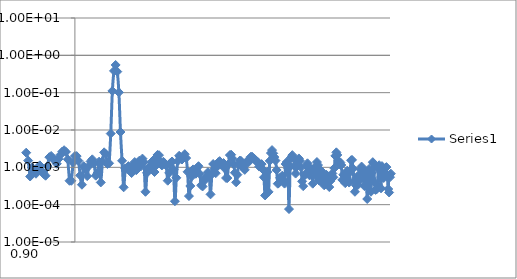
| Category | Series 0 |
|---|---|
| 0.00390625 | 1.403 |
| 0.0078125 | 0.412 |
| 0.01171875 | 0.04 |
| 0.015625 | 0.01 |
| 0.01953125 | 0.005 |
| 0.0234375 | 0.002 |
| 0.02734375 | 0.004 |
| 0.03125 | 0.005 |
| 0.03515625 | 0.004 |
| 0.0390625 | 0.002 |
| 0.04296875 | 0.002 |
| 0.046875 | 0.001 |
| 0.05078125 | 0.004 |
| 0.0546875 | 0.006 |
| 0.05859375 | 0.006 |
| 0.0625 | 0.005 |
| 0.06640625 | 0.004 |
| 0.0703125 | 0.002 |
| 0.07421875 | 0.002 |
| 0.078125 | 0.002 |
| 0.08203125 | 0.003 |
| 0.0859375 | 0.002 |
| 0.08984375 | 0.002 |
| 0.09375 | 0.002 |
| 0.09765625 | 0.002 |
| 0.1015625 | 0.001 |
| 0.1054688 | 0.001 |
| 0.109375 | 0.004 |
| 0.1132813 | 0.005 |
| 0.1171875 | 0.003 |
| 0.1210938 | 0.002 |
| 0.125 | 0.002 |
| 0.1289063 | 0.002 |
| 0.1328125 | 0.001 |
| 0.1367188 | 0.002 |
| 0.140625 | 0.003 |
| 0.1445313 | 0.001 |
| 0.1484375 | 0.001 |
| 0.1523438 | 0.002 |
| 0.15625 | 0.003 |
| 0.1601563 | 0.005 |
| 0.1640625 | 0.006 |
| 0.1679688 | 0.007 |
| 0.171875 | 0.006 |
| 0.1757813 | 0.004 |
| 0.1796875 | 0.003 |
| 0.1835938 | 0.002 |
| 0.1875 | 0.001 |
| 0.1914063 | 0.002 |
| 0.1953125 | 0.002 |
| 0.1992188 | 0.002 |
| 0.203125 | 0.003 |
| 0.2070313 | 0.004 |
| 0.2109375 | 0.004 |
| 0.2148438 | 0.003 |
| 0.21875 | 0.002 |
| 0.2226563 | 0.001 |
| 0.2265625 | 0 |
| 0.2304688 | 0.001 |
| 0.234375 | 0.002 |
| 0.2382813 | 0.002 |
| 0.2421875 | 0.001 |
| 0.2460938 | 0.002 |
| 0.25 | 0.002 |
| 0.2539063 | 0.002 |
| 0.2578125 | 0 |
| 0.2617188 | 0.001 |
| 0.265625 | 0.001 |
| 0.2695313 | 0.002 |
| 0.2734375 | 0.003 |
| 0.2773438 | 0.003 |
| 0.28125 | 0.002 |
| 0.2851563 | 0.003 |
| 0.2890625 | 0.004 |
| 0.2929688 | 0.003 |
| 0.296875 | 0.003 |
| 0.3007813 | 0.002 |
| 0.3046875 | 0.001 |
| 0.3085938 | 0.001 |
| 0.3125 | 0 |
| 0.3164063 | 0 |
| 0.3203125 | 0.001 |
| 0.3242188 | 0.001 |
| 0.328125 | 0.002 |
| 0.3320313 | 0.003 |
| 0.3359375 | 0.003 |
| 0.3398438 | 0.002 |
| 0.34375 | 0.001 |
| 0.3476563 | 0.001 |
| 0.3515625 | 0.002 |
| 0.3554688 | 0.001 |
| 0.359375 | 0.001 |
| 0.3632813 | 0 |
| 0.3671875 | 0 |
| 0.3710938 | 0.001 |
| 0.375 | 0.001 |
| 0.3789063 | 0 |
| 0.3828125 | 0.001 |
| 0.3867188 | 0.002 |
| 0.390625 | 0.001 |
| 0.3945313 | 0.001 |
| 0.3984375 | 0.001 |
| 0.4023438 | 0.002 |
| 0.40625 | 0.001 |
| 0.4101563 | 0.002 |
| 0.4140625 | 0.002 |
| 0.4179688 | 0.002 |
| 0.421875 | 0.001 |
| 0.4257813 | 0.001 |
| 0.4296875 | 0.002 |
| 0.4335938 | 0.002 |
| 0.4375 | 0.001 |
| 0.4414063 | 0.001 |
| 0.4453125 | 0.002 |
| 0.4492188 | 0.001 |
| 0.453125 | 0.002 |
| 0.4570313 | 0.002 |
| 0.4609375 | 0.002 |
| 0.4648438 | 0.003 |
| 0.46875 | 0.003 |
| 0.4726563 | 0.001 |
| 0.4765625 | 0.001 |
| 0.4804688 | 0.001 |
| 0.484375 | 0.001 |
| 0.4882813 | 0.001 |
| 0.4921875 | 0.001 |
| 0.4960938 | 0.002 |
| 0.5 | 0.001 |
| 0.5039063 | 0.001 |
| 0.5078125 | 0.002 |
| 0.5117188 | 0.003 |
| 0.515625 | 0.003 |
| 0.5195313 | 0.002 |
| 0.5234375 | 0.002 |
| 0.5273438 | 0.001 |
| 0.53125 | 0.001 |
| 0.5351563 | 0.002 |
| 0.5390625 | 0.002 |
| 0.5429688 | 0.002 |
| 0.546875 | 0.001 |
| 0.5507813 | 0.001 |
| 0.5546875 | 0.001 |
| 0.5585938 | 0.001 |
| 0.5625 | 0.001 |
| 0.5664063 | 0.002 |
| 0.5703125 | 0.001 |
| 0.5742188 | 0 |
| 0.578125 | 0.001 |
| 0.5820313 | 0.002 |
| 0.5859375 | 0.003 |
| 0.5898438 | 0.004 |
| 0.59375 | 0.003 |
| 0.5976563 | 0.001 |
| 0.6015625 | 0 |
| 0.6054688 | 0.002 |
| 0.609375 | 0.003 |
| 0.6132813 | 0.001 |
| 0.6171875 | 0.001 |
| 0.6210938 | 0.003 |
| 0.625 | 0.003 |
| 0.6289063 | 0.002 |
| 0.6328125 | 0.001 |
| 0.6367188 | 0.001 |
| 0.640625 | 0 |
| 0.6445313 | 0 |
| 0.6484375 | 0.001 |
| 0.6523438 | 0.002 |
| 0.65625 | 0.002 |
| 0.6601563 | 0.002 |
| 0.6640625 | 0.002 |
| 0.6679688 | 0.001 |
| 0.671875 | 0.001 |
| 0.6757813 | 0.001 |
| 0.6796875 | 0.002 |
| 0.6835938 | 0.003 |
| 0.6875 | 0.003 |
| 0.6914063 | 0.002 |
| 0.6953125 | 0.002 |
| 0.6992188 | 0.002 |
| 0.703125 | 0.002 |
| 0.7070313 | 0.001 |
| 0.7109375 | 0.001 |
| 0.7148438 | 0.001 |
| 0.71875 | 0.001 |
| 0.7226563 | 0 |
| 0.7265625 | 0.001 |
| 0.7304688 | 0.001 |
| 0.734375 | 0 |
| 0.7382813 | 0.001 |
| 0.7421875 | 0.002 |
| 0.7460938 | 0.003 |
| 0.75 | 0.003 |
| 0.7539063 | 0.002 |
| 0.7578125 | 0.002 |
| 0.7617188 | 0.002 |
| 0.765625 | 0.002 |
| 0.7695313 | 0.002 |
| 0.7734375 | 0.002 |
| 0.7773438 | 0.001 |
| 0.78125 | 0.001 |
| 0.7851563 | 0.001 |
| 0.7890625 | 0 |
| 0.7929688 | 0 |
| 0.796875 | 0.001 |
| 0.8007813 | 0.001 |
| 0.8046875 | 0.001 |
| 0.8085938 | 0.002 |
| 0.8125 | 0.003 |
| 0.8164063 | 0.002 |
| 0.8203125 | 0.001 |
| 0.8242188 | 0.001 |
| 0.828125 | 0 |
| 0.8320313 | 0.001 |
| 0.8359375 | 0.001 |
| 0.8398438 | 0.001 |
| 0.84375 | 0.001 |
| 0.8476563 | 0 |
| 0.8515625 | 0 |
| 0.8554688 | 0 |
| 0.859375 | 0.001 |
| 0.8632813 | 0.002 |
| 0.8671875 | 0.001 |
| 0.8710938 | 0.001 |
| 0.875 | 0.001 |
| 0.8789063 | 0.002 |
| 0.8828125 | 0.002 |
| 0.8867188 | 0.002 |
| 0.890625 | 0.002 |
| 0.8945313 | 0.003 |
| 0.8984375 | 0.002 |
| 0.9023438 | 0.002 |
| 0.90625 | 0.001 |
| 0.9101563 | 0.001 |
| 0.9140625 | 0.001 |
| 0.9179688 | 0.001 |
| 0.921875 | 0.001 |
| 0.9257813 | 0.001 |
| 0.9296875 | 0.001 |
| 0.9335938 | 0.001 |
| 0.9375 | 0.001 |
| 0.9414063 | 0.001 |
| 0.9453125 | 0.002 |
| 0.9492188 | 0.002 |
| 0.953125 | 0.002 |
| 0.9570313 | 0.001 |
| 0.9609375 | 0.001 |
| 0.9648438 | 0.002 |
| 0.96875 | 0.002 |
| 0.9726563 | 0.003 |
| 0.9765625 | 0.003 |
| 0.9804688 | 0.003 |
| 0.984375 | 0.002 |
| 0.9882813 | 0 |
| 0.9921875 | 0 |
| 0.9960938 | 0.001 |
| 1.0 | 0.002 |
| 1.003906 | 0.002 |
| 1.007813 | 0.002 |
| 1.011719 | 0.001 |
| 1.015625 | 0 |
| 1.019531 | 0.001 |
| 1.023438 | 0.001 |
| 1.027344 | 0.001 |
| 1.03125 | 0.001 |
| 1.035156 | 0.001 |
| 1.039063 | 0.002 |
| 1.042969 | 0.001 |
| 1.046875 | 0.001 |
| 1.050781 | 0.001 |
| 1.054688 | 0.001 |
| 1.058594 | 0 |
| 1.0625 | 0.001 |
| 1.066406 | 0.003 |
| 1.070313 | 0.002 |
| 1.074219 | 0.001 |
| 1.078125 | 0.001 |
| 1.082031 | 0.008 |
| 1.085938 | 0.111 |
| 1.089844 | 0.383 |
| 1.09375 | 0.552 |
| 1.097656 | 0.366 |
| 1.101563 | 0.102 |
| 1.105469 | 0.009 |
| 1.109375 | 0.001 |
| 1.113281 | 0 |
| 1.117188 | 0.001 |
| 1.121094 | 0.001 |
| 1.125 | 0.001 |
| 1.128906 | 0.001 |
| 1.132813 | 0.001 |
| 1.136719 | 0.001 |
| 1.140625 | 0.001 |
| 1.144531 | 0.001 |
| 1.148438 | 0.001 |
| 1.152344 | 0.002 |
| 1.15625 | 0.001 |
| 1.160156 | 0.002 |
| 1.164063 | 0.001 |
| 1.167969 | 0 |
| 1.171875 | 0.001 |
| 1.175781 | 0.001 |
| 1.179688 | 0.001 |
| 1.183594 | 0.001 |
| 1.1875 | 0.002 |
| 1.191406 | 0.001 |
| 1.195313 | 0.001 |
| 1.199219 | 0.002 |
| 1.203125 | 0.002 |
| 1.207031 | 0.001 |
| 1.210938 | 0.001 |
| 1.214844 | 0.001 |
| 1.21875 | 0.001 |
| 1.222656 | 0.001 |
| 1.226563 | 0 |
| 1.230469 | 0.001 |
| 1.234375 | 0.001 |
| 1.238281 | 0.001 |
| 1.242188 | 0.001 |
| 1.246094 | 0 |
| 1.25 | 0.001 |
| 1.253906 | 0.001 |
| 1.257813 | 0.002 |
| 1.261719 | 0.002 |
| 1.265625 | 0.002 |
| 1.269531 | 0.002 |
| 1.273438 | 0.002 |
| 1.277344 | 0.002 |
| 1.28125 | 0.001 |
| 1.285156 | 0 |
| 1.289063 | 0 |
| 1.292969 | 0.001 |
| 1.296875 | 0.001 |
| 1.300781 | 0.001 |
| 1.304688 | 0.001 |
| 1.308594 | 0.001 |
| 1.3125 | 0.001 |
| 1.316406 | 0.001 |
| 1.320313 | 0 |
| 1.324219 | 0 |
| 1.328125 | 0 |
| 1.332031 | 0.001 |
| 1.335938 | 0.001 |
| 1.339844 | 0.001 |
| 1.34375 | 0.001 |
| 1.347656 | 0 |
| 1.351563 | 0.001 |
| 1.355469 | 0.001 |
| 1.359375 | 0.001 |
| 1.363281 | 0.001 |
| 1.367188 | 0.001 |
| 1.371094 | 0.001 |
| 1.375 | 0.001 |
| 1.378906 | 0.001 |
| 1.382813 | 0.001 |
| 1.386719 | 0.001 |
| 1.390625 | 0.001 |
| 1.394531 | 0.001 |
| 1.398438 | 0.001 |
| 1.402344 | 0.001 |
| 1.40625 | 0.002 |
| 1.410156 | 0.002 |
| 1.414063 | 0.002 |
| 1.417969 | 0.001 |
| 1.421875 | 0.001 |
| 1.425781 | 0 |
| 1.429688 | 0.001 |
| 1.433594 | 0.001 |
| 1.4375 | 0.002 |
| 1.441406 | 0.001 |
| 1.445313 | 0.001 |
| 1.449219 | 0.001 |
| 1.453125 | 0.001 |
| 1.457031 | 0.001 |
| 1.460938 | 0.001 |
| 1.464844 | 0.001 |
| 1.46875 | 0.002 |
| 1.472656 | 0.002 |
| 1.476563 | 0.002 |
| 1.480469 | 0.002 |
| 1.484375 | 0.002 |
| 1.488281 | 0.001 |
| 1.492188 | 0.001 |
| 1.496094 | 0.001 |
| 1.5 | 0.001 |
| 1.503906 | 0.001 |
| 1.507813 | 0.001 |
| 1.511719 | 0.001 |
| 1.515625 | 0.001 |
| 1.519531 | 0 |
| 1.523438 | 0.001 |
| 1.527344 | 0.001 |
| 1.53125 | 0 |
| 1.535156 | 0.001 |
| 1.539063 | 0.002 |
| 1.542969 | 0.003 |
| 1.546875 | 0.002 |
| 1.550781 | 0.002 |
| 1.554688 | 0.002 |
| 1.558594 | 0.001 |
| 1.5625 | 0 |
| 1.566406 | 0 |
| 1.570313 | 0.001 |
| 1.574219 | 0.001 |
| 1.578125 | 0.001 |
| 1.582031 | 0 |
| 1.585938 | 0 |
| 1.589844 | 0.001 |
| 1.59375 | 0.001 |
| 1.597656 | 0.001 |
| 1.601563 | 0 |
| 1.605469 | 0.001 |
| 1.609375 | 0.002 |
| 1.613281 | 0.002 |
| 1.617188 | 0.002 |
| 1.621094 | 0.001 |
| 1.625 | 0.001 |
| 1.628906 | 0.001 |
| 1.632813 | 0.001 |
| 1.636719 | 0.002 |
| 1.640625 | 0.002 |
| 1.644531 | 0.001 |
| 1.648438 | 0 |
| 1.652344 | 0 |
| 1.65625 | 0.001 |
| 1.660156 | 0.001 |
| 1.664063 | 0.001 |
| 1.667969 | 0.001 |
| 1.671875 | 0.001 |
| 1.675781 | 0.001 |
| 1.679688 | 0.001 |
| 1.683594 | 0.001 |
| 1.6875 | 0 |
| 1.691406 | 0.001 |
| 1.695313 | 0.001 |
| 1.699219 | 0.001 |
| 1.703125 | 0.001 |
| 1.707031 | 0.001 |
| 1.710938 | 0 |
| 1.714844 | 0.001 |
| 1.71875 | 0.001 |
| 1.722656 | 0.001 |
| 1.726563 | 0 |
| 1.730469 | 0 |
| 1.734375 | 0.001 |
| 1.738281 | 0.001 |
| 1.742188 | 0.001 |
| 1.746094 | 0 |
| 1.75 | 0 |
| 1.753906 | 0 |
| 1.757813 | 0.001 |
| 1.761719 | 0.001 |
| 1.765625 | 0.001 |
| 1.769531 | 0.001 |
| 1.773438 | 0.002 |
| 1.777344 | 0.003 |
| 1.78125 | 0.002 |
| 1.785156 | 0.002 |
| 1.789063 | 0.001 |
| 1.792969 | 0.001 |
| 1.796875 | 0.001 |
| 1.800781 | 0 |
| 1.804688 | 0.001 |
| 1.808594 | 0.001 |
| 1.8125 | 0 |
| 1.816406 | 0.001 |
| 1.820313 | 0.001 |
| 1.824219 | 0.001 |
| 1.828125 | 0 |
| 1.832031 | 0.001 |
| 1.835938 | 0.002 |
| 1.839844 | 0.002 |
| 1.84375 | 0.001 |
| 1.847656 | 0 |
| 1.851563 | 0 |
| 1.855469 | 0 |
| 1.859375 | 0.001 |
| 1.863281 | 0 |
| 1.867188 | 0 |
| 1.871094 | 0.001 |
| 1.875 | 0.001 |
| 1.878906 | 0.001 |
| 1.882813 | 0.001 |
| 1.886719 | 0.001 |
| 1.890625 | 0 |
| 1.894531 | 0.001 |
| 1.898438 | 0.001 |
| 1.902344 | 0 |
| 1.90625 | 0.001 |
| 1.910156 | 0.001 |
| 1.914063 | 0.001 |
| 1.917969 | 0 |
| 1.921875 | 0.001 |
| 1.925781 | 0.001 |
| 1.929688 | 0.001 |
| 1.933594 | 0 |
| 1.9375 | 0 |
| 1.941406 | 0 |
| 1.945313 | 0 |
| 1.949219 | 0.001 |
| 1.953125 | 0.001 |
| 1.957031 | 0.001 |
| 1.960938 | 0 |
| 1.964844 | 0.001 |
| 1.96875 | 0.001 |
| 1.972656 | 0.001 |
| 1.976563 | 0.001 |
| 1.980469 | 0.001 |
| 1.984375 | 0.001 |
| 1.988281 | 0.001 |
| 1.992188 | 0 |
| 1.996094 | 0 |
| 2.0 | 0.001 |
| 2.003906 | 0.001 |
| 2.007813 | 0 |
| 2.011719 | 0 |
| 2.015625 | 0 |
| 2.019531 | 0.001 |
| 2.023438 | 0.002 |
| 2.027344 | 0.002 |
| 2.03125 | 0.002 |
| 2.035156 | 0.002 |
| 2.039063 | 0.002 |
| 2.042969 | 0.001 |
| 2.046875 | 0.002 |
| 2.050781 | 0.002 |
| 2.054688 | 0.002 |
| 2.058594 | 0.001 |
| 2.0625 | 0.001 |
| 2.066406 | 0.001 |
| 2.070313 | 0.001 |
| 2.074219 | 0.001 |
| 2.078125 | 0.001 |
| 2.082031 | 0.001 |
| 2.085938 | 0.001 |
| 2.089844 | 0.001 |
| 2.09375 | 0.001 |
| 2.097656 | 0.001 |
| 2.101563 | 0.001 |
| 2.105469 | 0.001 |
| 2.109375 | 0.001 |
| 2.113281 | 0 |
| 2.117188 | 0 |
| 2.121094 | 0.001 |
| 2.125 | 0.001 |
| 2.128906 | 0.001 |
| 2.132813 | 0.001 |
| 2.136719 | 0.001 |
| 2.140625 | 0.001 |
| 2.144531 | 0 |
| 2.148438 | 0 |
| 2.152344 | 0.001 |
| 2.15625 | 0.001 |
| 2.160156 | 0.001 |
| 2.164063 | 0.001 |
| 2.167969 | 0.001 |
| 2.171875 | 0 |
| 2.175781 | 0.001 |
| 2.179688 | 0.001 |
| 2.183594 | 0.001 |
| 2.1875 | 0.001 |
| 2.191406 | 0.001 |
| 2.195313 | 0.001 |
| 2.199219 | 0 |
| 2.203125 | 0 |
| 2.207031 | 0.001 |
| 2.210938 | 0.001 |
| 2.214844 | 0.001 |
| 2.21875 | 0.001 |
| 2.222656 | 0.001 |
| 2.226563 | 0.001 |
| 2.230469 | 0.002 |
| 2.234375 | 0.001 |
| 2.238281 | 0.001 |
| 2.242188 | 0.001 |
| 2.246094 | 0 |
| 2.25 | 0.001 |
| 2.253906 | 0.001 |
| 2.257813 | 0.001 |
| 2.261719 | 0.001 |
| 2.265625 | 0.001 |
| 2.269531 | 0.001 |
| 2.273438 | 0 |
| 2.277344 | 0 |
| 2.28125 | 0 |
| 2.285156 | 0 |
| 2.289063 | 0 |
| 2.292969 | 0.001 |
| 2.296875 | 0.001 |
| 2.300781 | 0.001 |
| 2.304688 | 0 |
| 2.308594 | 0.001 |
| 2.3125 | 0.001 |
| 2.316406 | 0.001 |
| 2.320313 | 0.001 |
| 2.324219 | 0.001 |
| 2.328125 | 0.001 |
| 2.332031 | 0.001 |
| 2.335938 | 0.001 |
| 2.339844 | 0 |
| 2.34375 | 0.001 |
| 2.347656 | 0.001 |
| 2.351563 | 0.001 |
| 2.355469 | 0.001 |
| 2.359375 | 0.001 |
| 2.363281 | 0.001 |
| 2.367188 | 0 |
| 2.371094 | 0 |
| 2.375 | 0 |
| 2.378906 | 0.001 |
| 2.382813 | 0.001 |
| 2.386719 | 0.001 |
| 2.390625 | 0 |
| 2.394531 | 0 |
| 2.398438 | 0 |
| 2.402344 | 0 |
| 2.40625 | 0 |
| 2.410156 | 0.001 |
| 2.414063 | 0 |
| 2.417969 | 0.001 |
| 2.421875 | 0.001 |
| 2.425781 | 0 |
| 2.429688 | 0.001 |
| 2.433594 | 0.001 |
| 2.4375 | 0.001 |
| 2.441406 | 0.001 |
| 2.445313 | 0.002 |
| 2.449219 | 0.001 |
| 2.453125 | 0.001 |
| 2.457031 | 0.001 |
| 2.460938 | 0.001 |
| 2.464844 | 0.001 |
| 2.46875 | 0.001 |
| 2.472656 | 0.001 |
| 2.476563 | 0.001 |
| 2.480469 | 0.002 |
| 2.484375 | 0.001 |
| 2.488281 | 0 |
| 2.492188 | 0.001 |
| 2.496094 | 0.001 |
| 2.5 | 0.001 |
| 2.503906 | 0 |
| 2.507813 | 0 |
| 2.511719 | 0 |
| 2.515625 | 0.001 |
| 2.519531 | 0.001 |
| 2.523438 | 0.001 |
| 2.527344 | 0.001 |
| 2.53125 | 0.001 |
| 2.535156 | 0.001 |
| 2.539063 | 0.001 |
| 2.542969 | 0.001 |
| 2.546875 | 0.001 |
| 2.550781 | 0 |
| 2.554688 | 0 |
| 2.558594 | 0.001 |
| 2.5625 | 0.001 |
| 2.566406 | 0.001 |
| 2.570313 | 0.001 |
| 2.574219 | 0.001 |
| 2.578125 | 0.001 |
| 2.582031 | 0.001 |
| 2.585938 | 0.001 |
| 2.589844 | 0.001 |
| 2.59375 | 0.001 |
| 2.597656 | 0.001 |
| 2.601563 | 0.001 |
| 2.605469 | 0.001 |
| 2.609375 | 0.001 |
| 2.613281 | 0 |
| 2.617188 | 0 |
| 2.621094 | 0 |
| 2.625 | 0 |
| 2.628906 | 0.001 |
| 2.632813 | 0.001 |
| 2.636719 | 0 |
| 2.640625 | 0 |
| 2.644531 | 0 |
| 2.648438 | 0.001 |
| 2.652344 | 0.001 |
| 2.65625 | 0.001 |
| 2.660156 | 0 |
| 2.664063 | 0.001 |
| 2.667969 | 0.001 |
| 2.671875 | 0 |
| 2.675781 | 0 |
| 2.679688 | 0 |
| 2.683594 | 0 |
| 2.6875 | 0 |
| 2.691406 | 0 |
| 2.695313 | 0 |
| 2.699219 | 0 |
| 2.703125 | 0 |
| 2.707031 | 0 |
| 2.710938 | 0 |
| 2.714844 | 0 |
| 2.71875 | 0 |
| 2.722656 | 0.001 |
| 2.726563 | 0 |
| 2.730469 | 0 |
| 2.734375 | 0.001 |
| 2.738281 | 0.001 |
| 2.742188 | 0.001 |
| 2.746094 | 0.001 |
| 2.75 | 0 |
| 2.753906 | 0 |
| 2.757813 | 0 |
| 2.761719 | 0 |
| 2.765625 | 0.001 |
| 2.769531 | 0.001 |
| 2.773438 | 0.001 |
| 2.777344 | 0.001 |
| 2.78125 | 0.001 |
| 2.785156 | 0.001 |
| 2.789063 | 0.001 |
| 2.792969 | 0 |
| 2.796875 | 0 |
| 2.800781 | 0.001 |
| 2.804688 | 0.002 |
| 2.808594 | 0.002 |
| 2.8125 | 0.001 |
| 2.816406 | 0 |
| 2.820313 | 0 |
| 2.824219 | 0 |
| 2.828125 | 0 |
| 2.832031 | 0.001 |
| 2.835938 | 0.001 |
| 2.839844 | 0.001 |
| 2.84375 | 0 |
| 2.847656 | 0 |
| 2.851563 | 0 |
| 2.855469 | 0.001 |
| 2.859375 | 0 |
| 2.863281 | 0.001 |
| 2.867188 | 0.001 |
| 2.871094 | 0.001 |
| 2.875 | 0.001 |
| 2.878906 | 0.001 |
| 2.882813 | 0.001 |
| 2.886719 | 0.001 |
| 2.890625 | 0.001 |
| 2.894531 | 0.001 |
| 2.898438 | 0 |
| 2.902344 | 0 |
| 2.90625 | 0.001 |
| 2.910156 | 0.001 |
| 2.914063 | 0 |
| 2.917969 | 0 |
| 2.921875 | 0.001 |
| 2.925781 | 0.002 |
| 2.929688 | 0.002 |
| 2.933594 | 0.002 |
| 2.9375 | 0.002 |
| 2.941406 | 0.002 |
| 2.945313 | 0.002 |
| 2.949219 | 0.002 |
| 2.953125 | 0.001 |
| 2.957031 | 0.001 |
| 2.960938 | 0.001 |
| 2.964844 | 0.001 |
| 2.96875 | 0 |
| 2.972656 | 0 |
| 2.976563 | 0.001 |
| 2.980469 | 0.001 |
| 2.984375 | 0.001 |
| 2.988281 | 0.001 |
| 2.992188 | 0.001 |
| 2.996094 | 0 |
| 3.0 | 0.001 |
| 3.003906 | 0.001 |
| 3.007813 | 0 |
| 3.011719 | 0.001 |
| 3.015625 | 0.001 |
| 3.019531 | 0.001 |
| 3.023438 | 0 |
| 3.027344 | 0.001 |
| 3.03125 | 0.001 |
| 3.035156 | 0.001 |
| 3.039063 | 0.001 |
| 3.042969 | 0.001 |
| 3.046875 | 0.001 |
| 3.050781 | 0 |
| 3.054688 | 0 |
| 3.058594 | 0 |
| 3.0625 | 0 |
| 3.066406 | 0 |
| 3.070313 | 0 |
| 3.074219 | 0 |
| 3.078125 | 0.001 |
| 3.082031 | 0.001 |
| 3.085938 | 0.001 |
| 3.089844 | 0.001 |
| 3.09375 | 0.001 |
| 3.097656 | 0.001 |
| 3.101563 | 0.001 |
| 3.105469 | 0.001 |
| 3.109375 | 0.001 |
| 3.113281 | 0.001 |
| 3.117188 | 0.001 |
| 3.121094 | 0.001 |
| 3.125 | 0 |